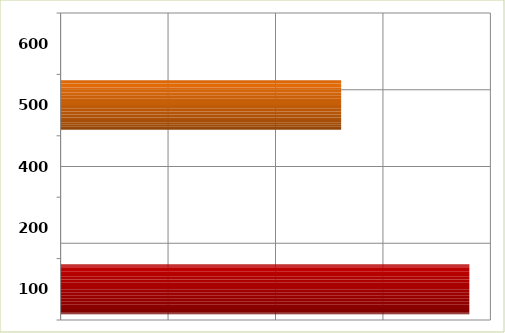
| Category | Series 0 |
|---|---|
| 100.0 | 19019908 |
| 200.0 | 0 |
| 400.0 | 0 |
| 500.0 | 13054400 |
| 600.0 | 0 |